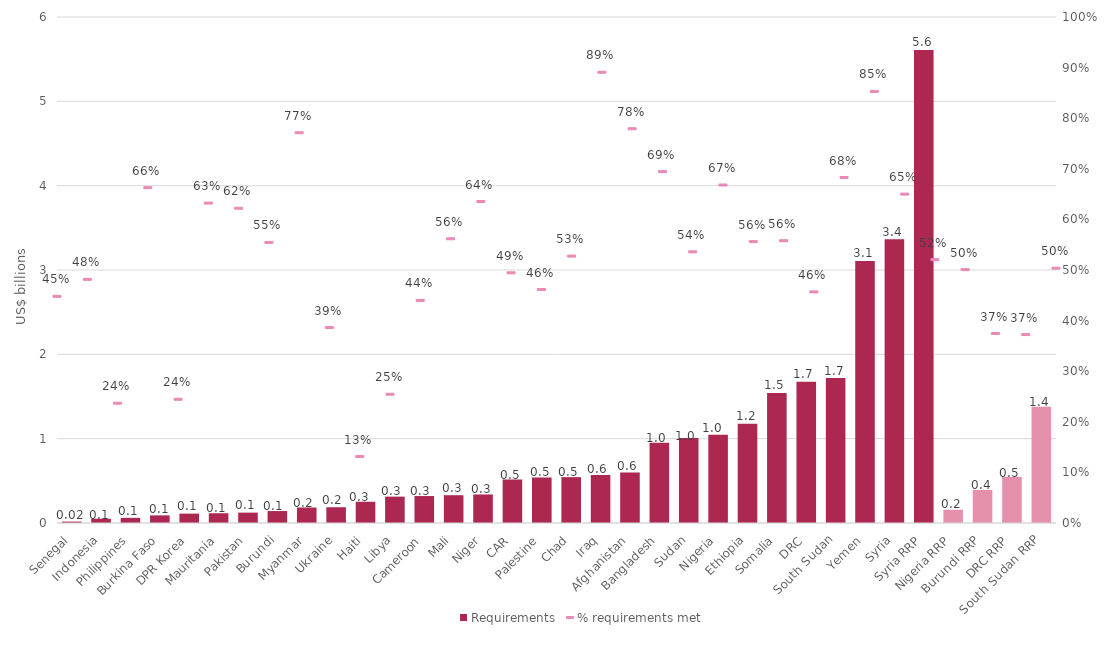
| Category | Requirements |
|---|---|
| Senegal | 16833024 |
| Indonesia | 50500000 |
| Philippines | 61004152 |
| Burkina Faso | 90291110 |
| DPR Korea | 111217000 |
| Mauritania | 116000000 |
| Pakistan | 123004259 |
| Burundi | 141814441 |
| Myanmar | 183400000 |
| Ukraine | 186909122 |
| Haiti | 252200142 |
| Libya | 312740102 |
| Cameroon | 319676453 |
| Mali | 329565482 |
| Niger | 338303089 |
| CAR | 515600000 |
| Palestine | 539721755 |
| Chad | 543769241 |
| Iraq | 568745625 |
| Afghanistan | 598923998 |
| Bangladesh | 950834205 |
| Sudan | 1007555093 |
| Nigeria | 1047768587 |
| Ethiopia | 1177218620 |
| Somalia | 1542514570 |
| DRC | 1675200000 |
| South Sudan | 1717890485 |
| Yemen | 3108067800 |
| Syria | 3364410629 |
| Syria RRP | 5608951510 |
| Nigeria RRP | 156586701 |
| Burundi RRP | 391196905 |
| DRC RRP | 547049611 |
| South Sudan RRP | 1379415957 |